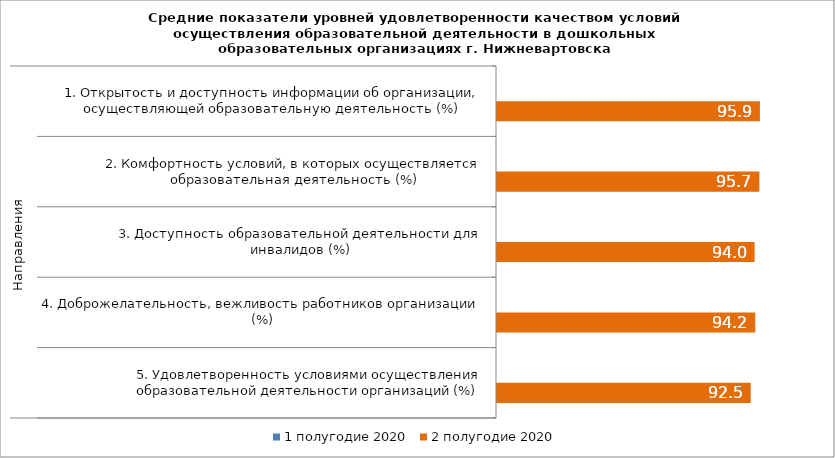
| Category | 1 полугодие 2020 | 2 полугодие 2020 |
|---|---|---|
| 0 | 0 | 95.899 |
| 1 | 0 | 95.704 |
| 2 | 0 | 93.961 |
| 3 | 0 | 94.2 |
| 4 | 0 | 92.548 |